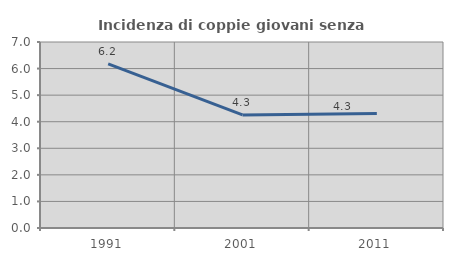
| Category | Incidenza di coppie giovani senza figli |
|---|---|
| 1991.0 | 6.18 |
| 2001.0 | 4.255 |
| 2011.0 | 4.306 |